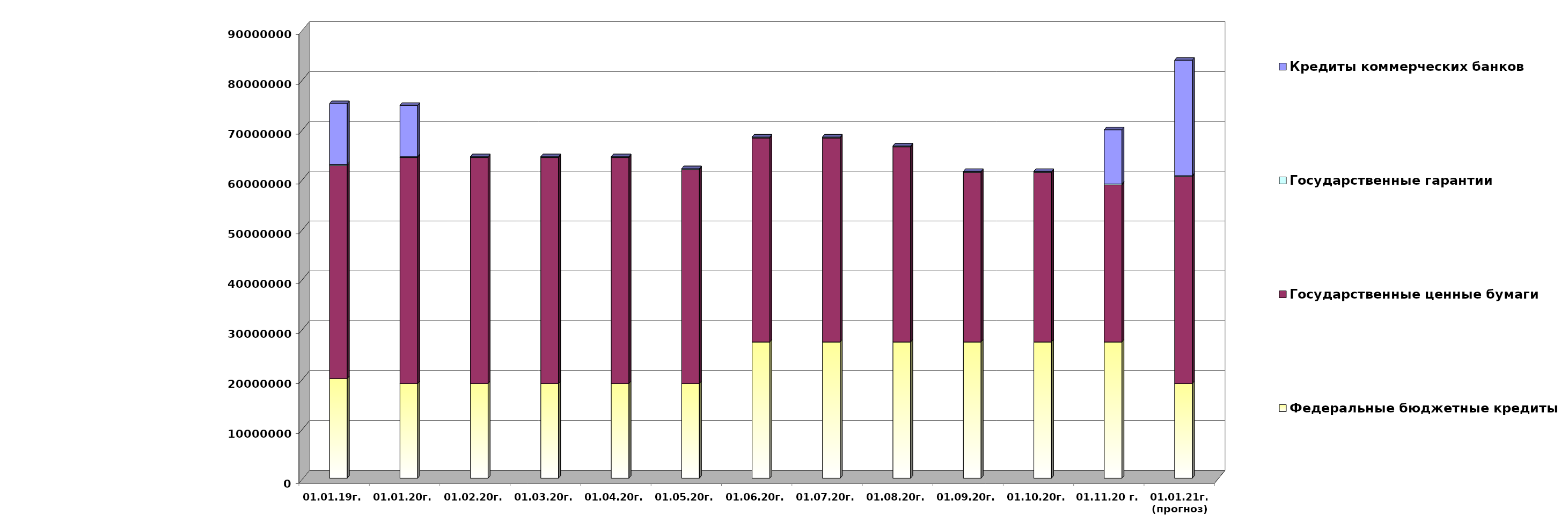
| Category | Федеральные бюджетные кредиты | Государственные ценные бумаги  | Государственные гарантии | Кредиты коммерческих банков |
|---|---|---|---|---|
| 01.01.19г. | 19957026.213 | 42700000 | 209872.86 | 12219963.75 |
| 01.01.20г. | 18954967.463 | 45300000 | 186330.02 | 10291177 |
| 01.02.20г. | 18954967.463 | 45300000 | 184738.25 | 0 |
| 01.03.20г. | 18954967.463 | 45300000 | 184738.25 | 0 |
| 01.04.20г. | 18954967.463 | 45300000 | 184738.25 | 0 |
| 01.05.20г. | 18954967.463 | 42900000 | 184738.25 | 0 |
| 01.06.20г. | 27303300.463 | 40900000 | 184738.25 | 0 |
| 01.07.20г. | 27303300.463 | 40900000 | 184738.25 | 0 |
| 01.08.20г. | 27303300.463 | 39100000 | 184738.25 | 0 |
| 01.09.20г. | 27303300.463 | 34000000 | 184738.25 | 0 |
| 01.10.20г. | 27303300.463 | 34000000 | 184738.25 | 0 |
| 01.11.20 г. | 27303300.463 | 31500000 | 184738.25 | 10848333 |
| 01.01.21г.
(прогноз) | 18954967.5 | 41500000 | 184738.2 | 23154486.5 |